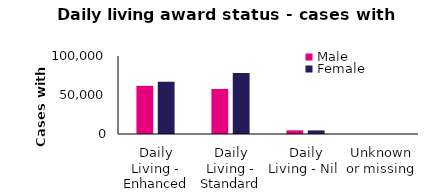
| Category | Male | Female |
|---|---|---|
| Daily Living - Enhanced | 61750 | 66975 |
| Daily Living - Standard | 57761 | 78103 |
| Daily Living - Nil  | 4671 | 4619 |
| Unknown or missing | 6 | 8 |